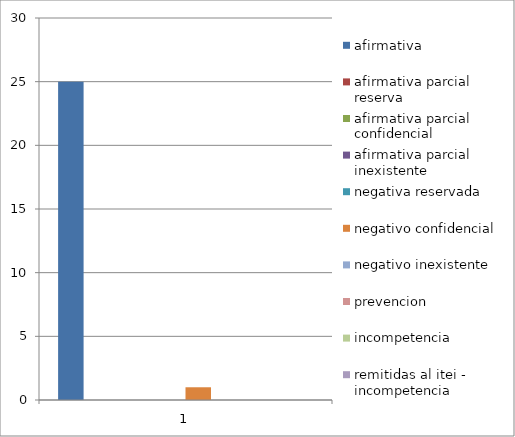
| Category | afirmativa  | afirmativa parcial reserva | afirmativa parcial confidencial | afirmativa parcial inexistente | negativa reservada | negativo confidencial | negativo inexistente | prevencion | incompetencia | remitidas al itei - incompetencia |
|---|---|---|---|---|---|---|---|---|---|---|
| 0 | 25 | 0 | 0 | 0 | 0 | 1 | 0 | 0 | 0 | 0 |